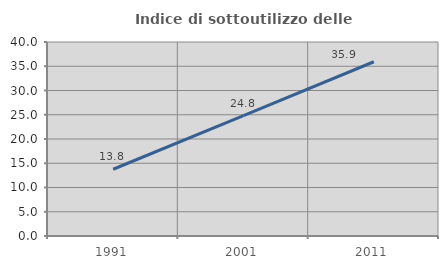
| Category | Indice di sottoutilizzo delle abitazioni  |
|---|---|
| 1991.0 | 13.764 |
| 2001.0 | 24.813 |
| 2011.0 | 35.929 |